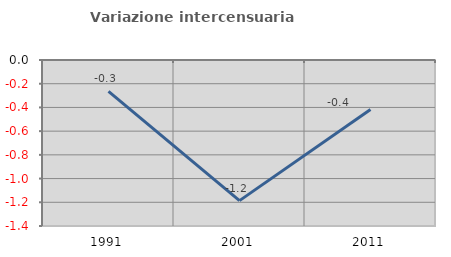
| Category | Variazione intercensuaria annua |
|---|---|
| 1991.0 | -0.264 |
| 2001.0 | -1.186 |
| 2011.0 | -0.418 |